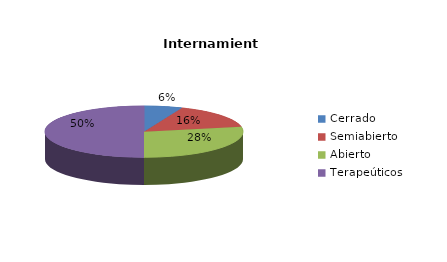
| Category | Series 0 |
|---|---|
| Cerrado | 2 |
| Semiabierto | 5 |
| Abierto | 9 |
| Terapeúticos | 16 |